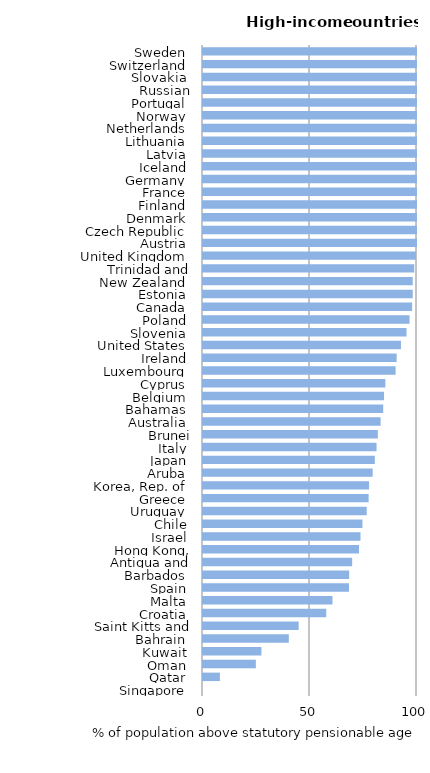
| Category | Series 0 |
|---|---|
| Singapore | 0 |
| Qatar | 7.9 |
| Oman | 24.7 |
| Kuwait | 27.3 |
| Bahrain | 40.1 |
| Saint Kitts and Nevis | 44.7 |
| Croatia | 57.6 |
| Malta | 60.5 |
| Spain | 68.2 |
| Barbados | 68.3 |
| Antigua and Barbuda | 69.7 |
| Hong Kong, China | 72.9 |
| Israel | 73.6 |
| Chile | 74.5 |
| Uruguay | 76.5 |
| Greece | 77.4 |
| Korea, Rep. of | 77.6 |
| Aruba | 79.3 |
| Japan | 80.3 |
| Italy | 81.1 |
| Brunei Darussalam | 81.7 |
| Australia | 83 |
| Bahamas | 84.2 |
| Belgium | 84.6 |
| Cyprus | 85.2 |
| Luxembourg | 90 |
| Ireland | 90.5 |
| United States | 92.5 |
| Slovenia | 95.1 |
| Poland | 96.5 |
| Canada | 97.7 |
| Estonia | 98 |
| New Zealand | 98 |
| Trinidad and Tobago | 98.7 |
| United Kingdom | 99.5 |
| Austria | 100 |
| Czech Republic | 100 |
| Denmark | 100 |
| Finland | 100 |
| France | 100 |
| Germany | 100 |
| Iceland | 100 |
| Latvia | 100 |
| Lithuania | 100 |
| Netherlands | 100 |
| Norway | 100 |
| Portugal | 100 |
| Russian Federation | 100 |
| Slovakia | 100 |
| Switzerland | 100 |
| Sweden | 100 |